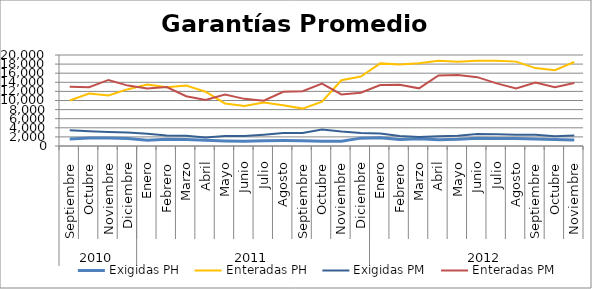
| Category | Exigidas PH | Enteradas PH | Exigidas PM | Enteradas PM |
|---|---|---|---|---|
| 0 | 1528.048 | 9989.528 | 3482.397 | 13040.893 |
| 1 | 1765.671 | 11522.563 | 3249.678 | 12931.878 |
| 2 | 1744.818 | 11123.372 | 3083.204 | 14519.409 |
| 3 | 1659.203 | 12493.623 | 2971.808 | 13273.812 |
| 4 | 1282.931 | 13511.197 | 2715.795 | 12631.271 |
| 5 | 1469.886 | 12912.935 | 2313.398 | 12967.84 |
| 6 | 1451.049 | 13292.147 | 2234.5 | 10944.124 |
| 7 | 1243.266 | 11940.059 | 1876.192 | 10106.188 |
| 8 | 1094.477 | 9346.935 | 2211.516 | 11309.35 |
| 9 | 1038.181 | 8772.488 | 2185.859 | 10360.845 |
| 10 | 1150.33 | 9583.522 | 2484.933 | 9954.534 |
| 11 | 1204.945 | 8947.225 | 2874.347 | 11912.953 |
| 12 | 1181.135 | 8218.837 | 2868.226 | 12046.458 |
| 13 | 1047.181 | 9725.758 | 3619.145 | 13704.352 |
| 14 | 1067.214 | 14456.861 | 3177.175 | 11327.495 |
| 15 | 1729.716 | 15271.717 | 2830.669 | 11719.895 |
| 16 | 1828.564 | 18155.583 | 2744.93 | 13413.991 |
| 17 | 1451.155 | 17917.734 | 2215.902 | 13440.832 |
| 18 | 1587.31 | 18166.129 | 1968.766 | 12673.714 |
| 19 | 1353.003 | 18741.256 | 2118.782 | 15515.723 |
| 20 | 1464.668 | 18540.927 | 2278.002 | 15625.393 |
| 21 | 1719.43 | 18734.539 | 2626.915 | 15127.903 |
| 22 | 1674.023 | 18761.463 | 2556.575 | 13766.49 |
| 23 | 1647.243 | 18544.546 | 2463.76 | 12637.427 |
| 24 | 1556.152 | 17124.972 | 2459.803 | 13929.715 |
| 25 | 1402.926 | 16653.067 | 2169.047 | 12937.81 |
| 26 | 1329.011 | 18467.462 | 2322.009 | 13825.53 |